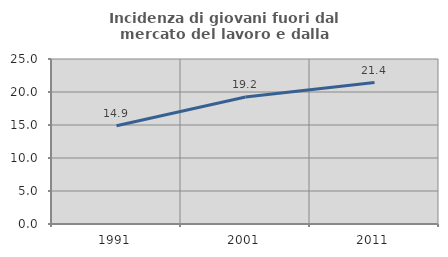
| Category | Incidenza di giovani fuori dal mercato del lavoro e dalla formazione  |
|---|---|
| 1991.0 | 14.894 |
| 2001.0 | 19.231 |
| 2011.0 | 21.429 |